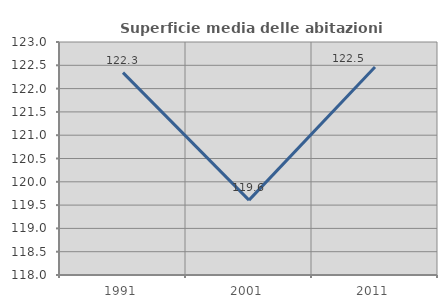
| Category | Superficie media delle abitazioni occupate |
|---|---|
| 1991.0 | 122.343 |
| 2001.0 | 119.606 |
| 2011.0 | 122.464 |